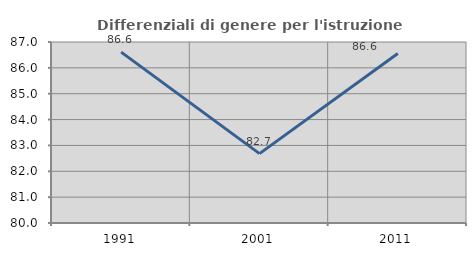
| Category | Differenziali di genere per l'istruzione superiore |
|---|---|
| 1991.0 | 86.61 |
| 2001.0 | 82.683 |
| 2011.0 | 86.553 |